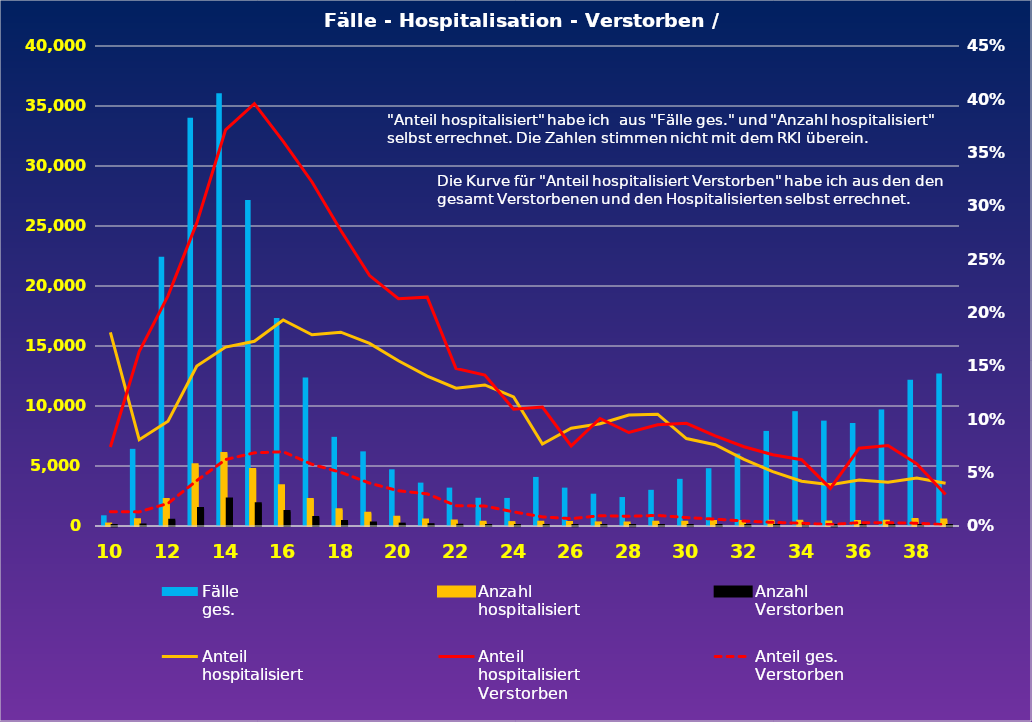
| Category | Fälle
ges. | Anzahl
hospitalisiert | Anzahl
Verstorben |
|---|---|---|---|
| 10.0 | 892 | 162 | 12 |
| 11.0 | 6430 | 520 | 85 |
| 12.0 | 22433 | 2202 | 475 |
| 13.0 | 34017 | 5099 | 1449 |
| 14.0 | 36070 | 6051 | 2247 |
| 15.0 | 27163 | 4705 | 1863 |
| 16.0 | 17334 | 3348 | 1207 |
| 17.0 | 12366 | 2217 | 715 |
| 18.0 | 7430 | 1350 | 374 |
| 19.0 | 6220 | 1065 | 250 |
| 20.0 | 4724 | 732 | 156 |
| 21.0 | 3614 | 508 | 109 |
| 22.0 | 3198 | 413 | 61 |
| 23.0 | 2352 | 311 | 44 |
| 24.0 | 2339 | 283 | 31 |
| 25.0 | 4089 | 314 | 35 |
| 26.0 | 3197 | 293 | 22 |
| 27.0 | 2692 | 258 | 26 |
| 28.0 | 2414 | 251 | 22 |
| 29.0 | 3015 | 316 | 30 |
| 30.0 | 3929 | 322 | 31 |
| 31.0 | 4815 | 367 | 31 |
| 32.0 | 6034 | 377 | 28 |
| 33.0 | 7924 | 404 | 27 |
| 34.0 | 9568 | 402 | 25 |
| 35.0 | 8781 | 340 | 12 |
| 36.0 | 8585 | 370 | 27 |
| 37.0 | 9714 | 398 | 30 |
| 38.0 | 12196 | 549 | 32 |
| 39.0 | 12709 | 509 | 15 |